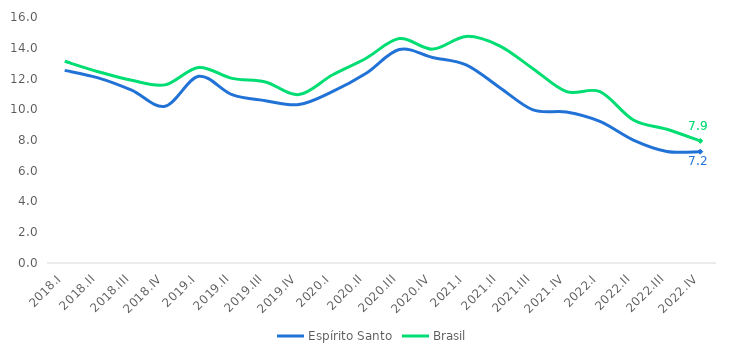
| Category | Espírito Santo | Brasil |
|---|---|---|
| 2018.I | 12.528 | 13.122 |
| 2018.II | 12.042 | 12.442 |
| 2018.III | 11.239 | 11.882 |
| 2018.IV | 10.192 | 11.586 |
| 2019.I | 12.143 | 12.719 |
| 2019.II | 10.949 | 12.009 |
| 2019.III | 10.555 | 11.771 |
| 2019.IV | 10.303 | 10.954 |
| 2020.I | 11.143 | 12.229 |
| 2020.II | 12.321 | 13.304 |
| 2020.III | 13.881 | 14.595 |
| 2020.IV | 13.367 | 13.911 |
| 2021.I | 12.888 | 14.738 |
| 2021.II | 11.419 | 14.128 |
| 2021.III | 9.955 | 12.641 |
| 2021.IV | 9.82 | 11.146 |
| 2022.I | 9.207 | 11.144 |
| 2022.II | 7.994 | 9.303 |
| 2022.III | 7.253 | 8.7 |
| 2022.IV | 7.239 | 7.941 |